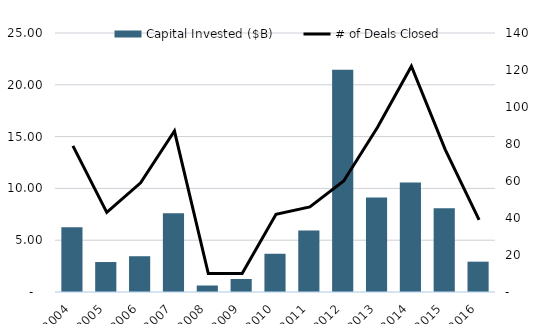
| Category | Capital Invested ($B) |
|---|---|
| 2004.0 | 6.251 |
| 2005.0 | 2.892 |
| 2006.0 | 3.453 |
| 2007.0 | 7.611 |
| 2008.0 | 0.626 |
| 2009.0 | 1.255 |
| 2010.0 | 3.692 |
| 2011.0 | 5.939 |
| 2012.0 | 21.458 |
| 2013.0 | 9.117 |
| 2014.0 | 10.566 |
| 2015.0 | 8.073 |
| 2016.0 | 2.929 |